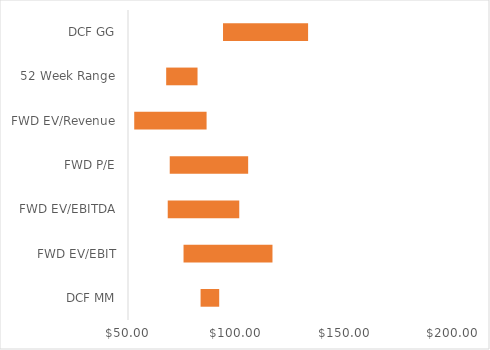
| Category | Q1 | Spread | Q3 |
|---|---|---|---|
| DCF MM | 83.497 | 8.594 | 92.092 |
| FWD EV/EBIT | 75.63 | 41.05 | 116.68 |
| FWD EV/EBITDA | 68.338 | 33.011 | 101.349 |
| FWD P/E | 69.264 | 36.197 | 105.46 |
| FWD EV/Revenue | 52.874 | 33.397 | 86.271 |
| 52 Week Range | 67.62 | 14.47 | 82.09 |
| DCF GG | 93.853 | 39.264 | 133.117 |